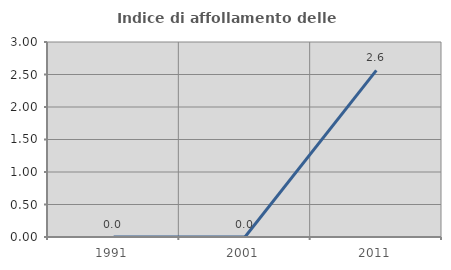
| Category | Indice di affollamento delle abitazioni  |
|---|---|
| 1991.0 | 0 |
| 2001.0 | 0 |
| 2011.0 | 2.564 |